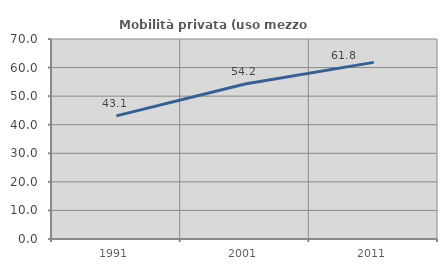
| Category | Mobilità privata (uso mezzo privato) |
|---|---|
| 1991.0 | 43.103 |
| 2001.0 | 54.225 |
| 2011.0 | 61.818 |